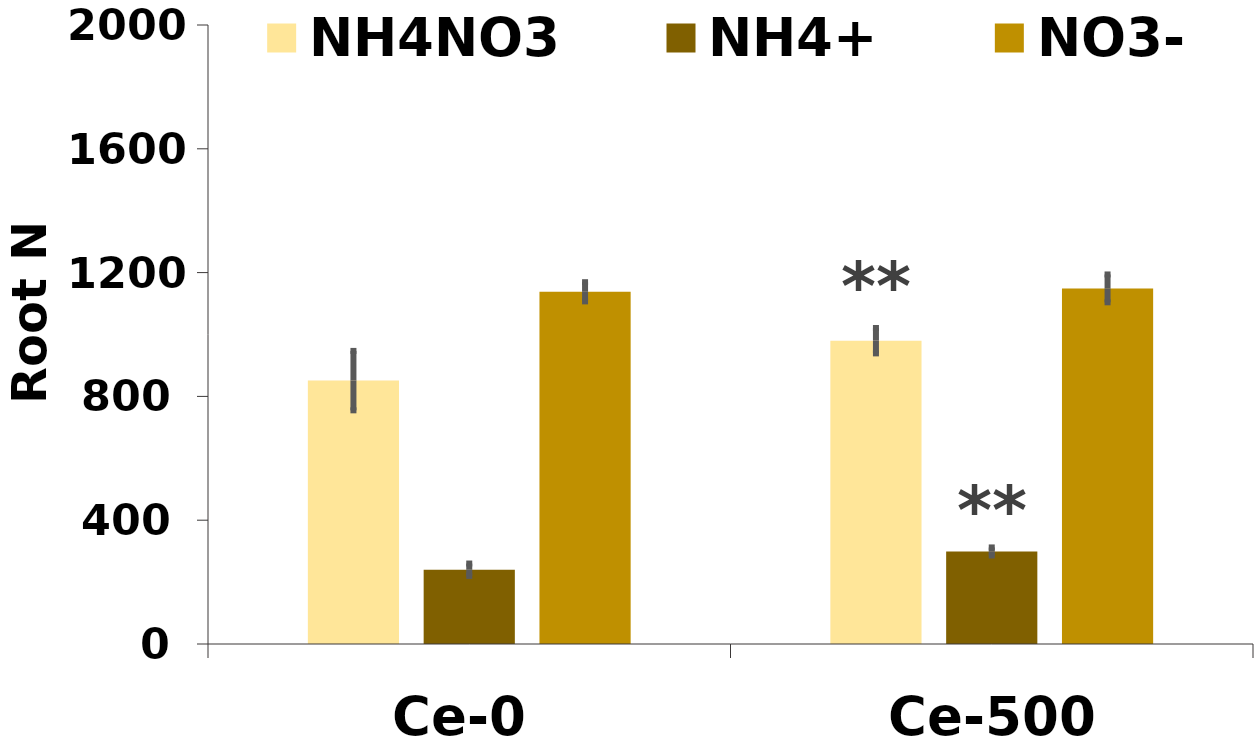
| Category | NH4NO3 | NH4+ | NO3- |
|---|---|---|---|
| Ce-0 | 851 | 240 | 1138 |
| Ce-500 | 980 | 299 | 1149 |